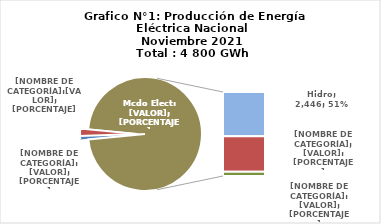
| Category | Series 0 |
|---|---|
| 0 | 45.503 |
| 1 | 101.28 |
| 2 | 2446.458 |
| 3 | 1970.361 |
| 4 | 236.053 |